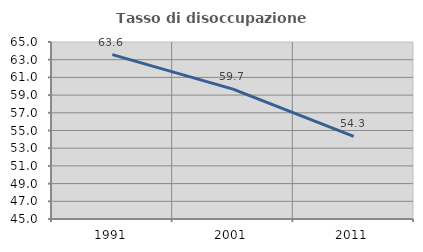
| Category | Tasso di disoccupazione giovanile  |
|---|---|
| 1991.0 | 63.567 |
| 2001.0 | 59.669 |
| 2011.0 | 54.329 |